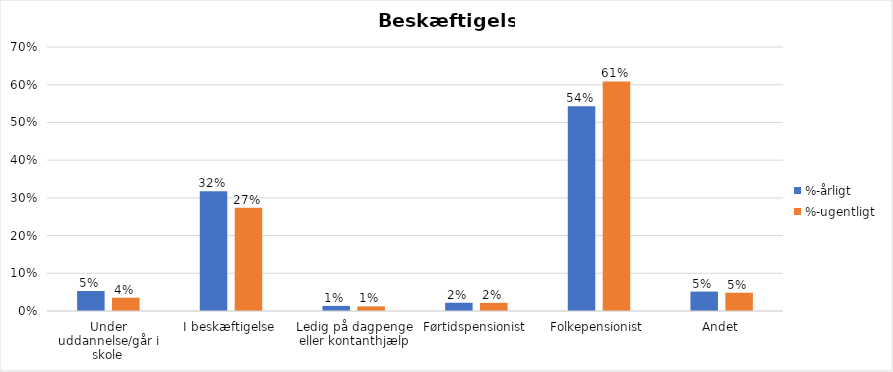
| Category | %-årligt | %-ugentligt |
|---|---|---|
| Under uddannelse/går i skole | 0.053 | 0.035 |
| I beskæftigelse | 0.317 | 0.274 |
| Ledig på dagpenge eller kontanthjælp | 0.014 | 0.012 |
| Førtidspensionist | 0.022 | 0.022 |
| Folkepensionist | 0.543 | 0.609 |
| Andet | 0.051 | 0.048 |